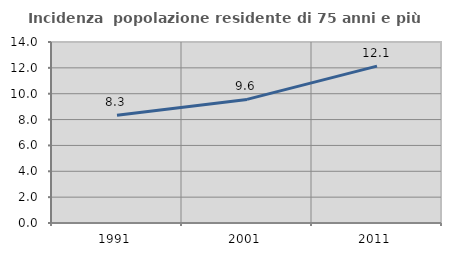
| Category | Incidenza  popolazione residente di 75 anni e più |
|---|---|
| 1991.0 | 8.338 |
| 2001.0 | 9.561 |
| 2011.0 | 12.134 |